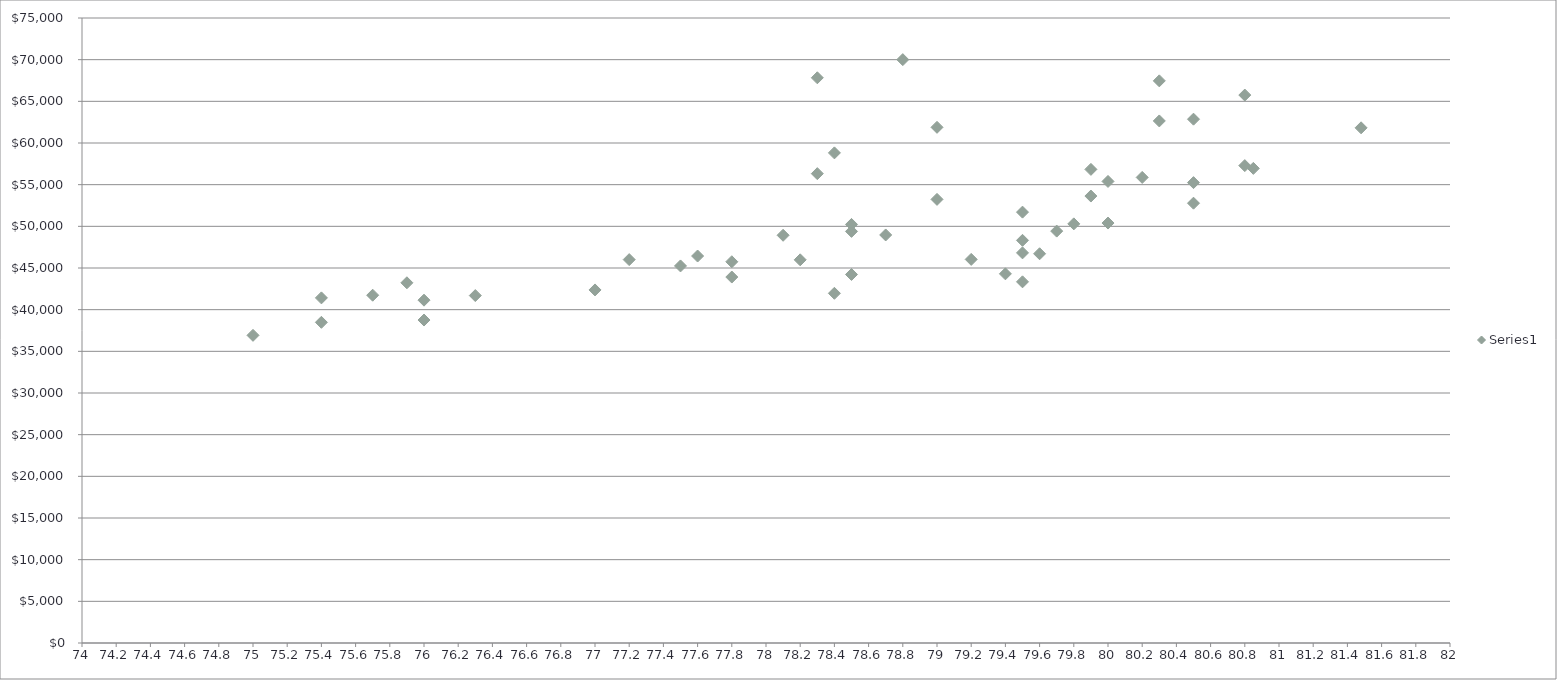
| Category | Series 0 |
|---|---|
| 75.4 | 41415 |
| 78.3 | 67825 |
| 79.6 | 46709 |
| 76.0 | 38758 |
| 80.8 | 57287 |
| 80.0 | 55387 |
| 80.8 | 65753 |
| 78.4 | 58814 |
| 79.4 | 44299 |
| 77.2 | 46007 |
| 81.48 | 61821 |
| 79.5 | 43341 |
| 79.0 | 53234 |
| 77.6 | 46438 |
| 79.7 | 49427 |
| 78.7 | 48964 |
| 76.0 | 41141 |
| 75.7 | 41734 |
| 79.2 | 46033 |
| 78.8 | 70004 |
| 80.5 | 62859 |
| 78.2 | 45981 |
| 80.85 | 56954 |
| 75.0 | 36919 |
| 77.5 | 45247 |
| 78.5 | 44222 |
| 79.8 | 50296 |
| 78.1 | 48927 |
| 80.3 | 62647 |
| 80.3 | 67458 |
| 78.4 | 41963 |
| 80.5 | 55246 |
| 77.8 | 43916 |
| 79.5 | 51704 |
| 77.8 | 45749 |
| 75.9 | 43225 |
| 79.5 | 46816 |
| 78.5 | 50228 |
| 79.9 | 53636 |
| 77.0 | 42367 |
| 79.5 | 48321 |
| 76.3 | 41693 |
| 78.5 | 49392 |
| 80.2 | 55869 |
| 80.5 | 52776 |
| 79.0 | 61882 |
| 79.9 | 56835 |
| 75.4 | 38482 |
| 80.0 | 50395 |
| 78.3 | 56322 |